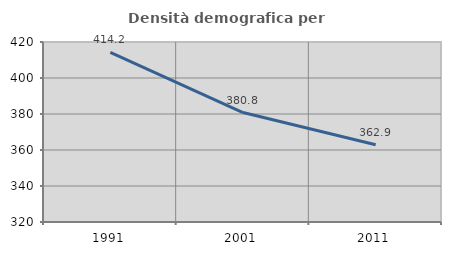
| Category | Densità demografica |
|---|---|
| 1991.0 | 414.227 |
| 2001.0 | 380.821 |
| 2011.0 | 362.898 |